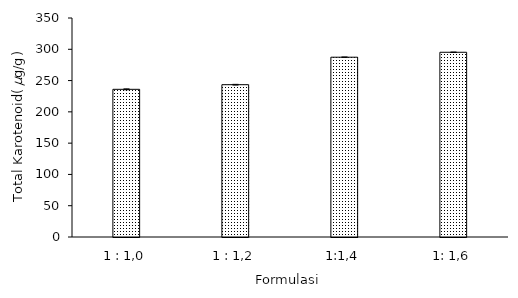
| Category | Total Karotenoid (µg/g) |
|---|---|
| 1 : 1,0 | 236.024 |
| 1 : 1,2 | 243.408 |
| 1:1,4 | 287.342 |
| 1: 1,6 | 295.237 |